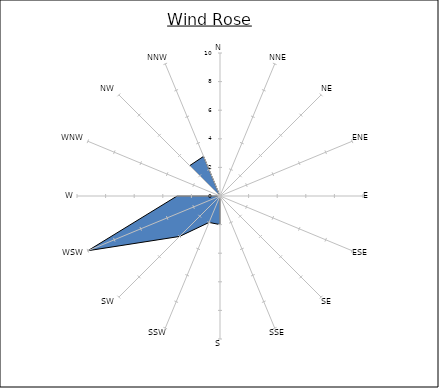
| Category | Series 0 |
|---|---|
| N | 0 |
| NNE | 0 |
| NE | 1 |
| ENE | 0 |
| E | 0 |
| ESE | 0 |
| SE | 3 |
| SSE | 0 |
| S | 2 |
| SSW | 2 |
| SW | 4 |
| WSW | 10 |
| W | 3 |
| WNW | 0 |
| NW | 3 |
| NNW | 3 |